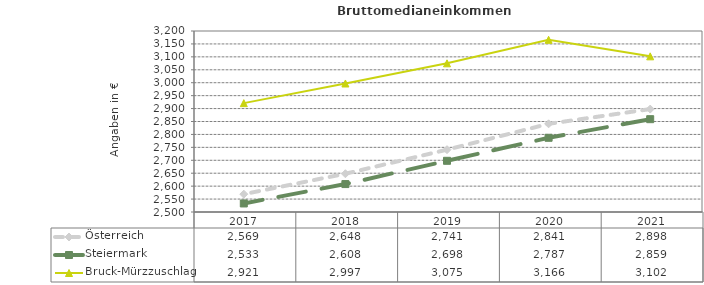
| Category | Österreich | Steiermark | Bruck-Mürzzuschlag |
|---|---|---|---|
| 2021.0 | 2898 | 2859 | 3102 |
| 2020.0 | 2841 | 2787 | 3166 |
| 2019.0 | 2741 | 2698 | 3075 |
| 2018.0 | 2648 | 2608 | 2997 |
| 2017.0 | 2569 | 2533 | 2921 |